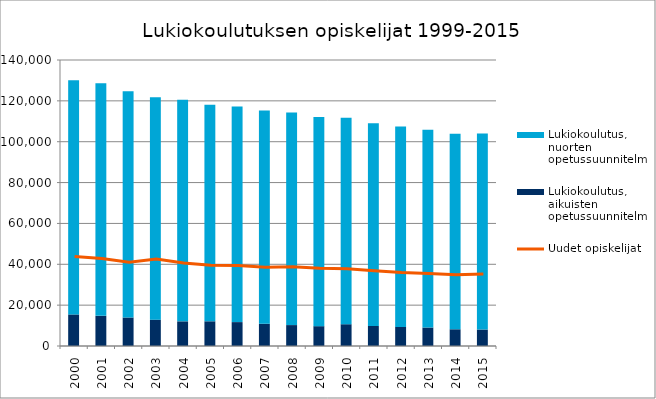
| Category | Lukiokoulutus, aikuisten opetussuunnitelma | Lukiokoulutus, nuorten opetussuunnitelma |
|---|---|---|
| 2000.0 | 15445 | 114587 |
| 2001.0 | 14755 | 113887 |
| 2002.0 | 13951 | 110693 |
| 2003.0 | 12892 | 108924 |
| 2004.0 | 12068 | 108463 |
| 2005.0 | 12091 | 106020 |
| 2006.0 | 11688 | 105572 |
| 2007.0 | 10885 | 104368 |
| 2008.0 | 10230 | 104010 |
| 2009.0 | 9713 | 102375 |
| 2010.0 | 10661 | 101117 |
| 2011.0 | 9778 | 99268 |
| 2012.0 | 9357 | 98055 |
| 2013.0 | 9043 | 96855 |
| 2014.0 | 8182 | 95732 |
| 2015.0 | 8066 | 95994 |